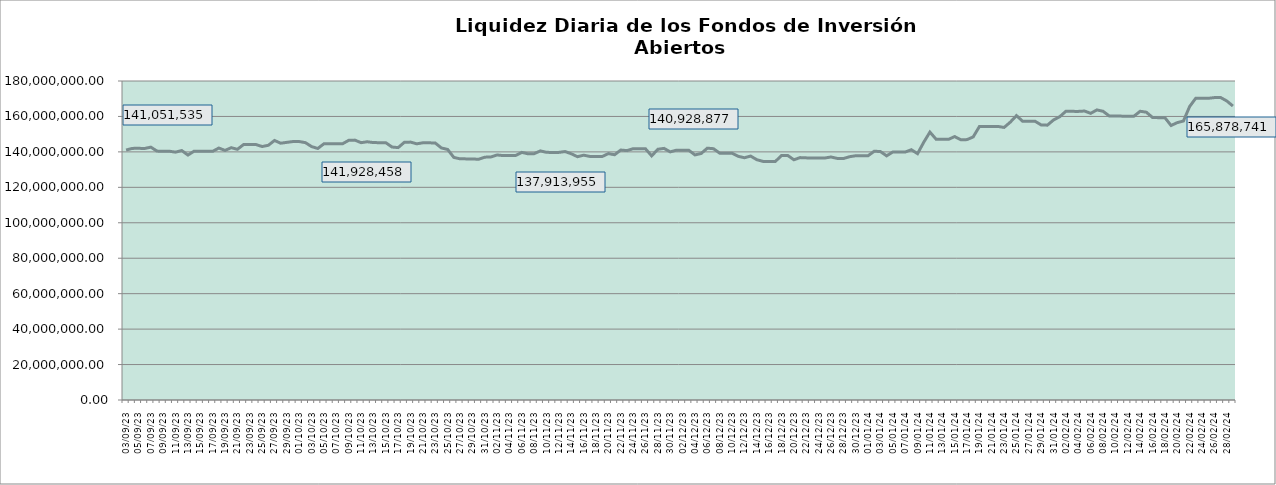
| Category | Series 0 |
|---|---|
| 2023-09-03 | 141051534.51 |
| 2023-09-04 | 141972949.27 |
| 2023-09-05 | 142009197.97 |
| 2023-09-06 | 141922684.19 |
| 2023-09-07 | 142673507.27 |
| 2023-09-08 | 140438336.78 |
| 2023-09-09 | 140378215.04 |
| 2023-09-10 | 140361923.22 |
| 2023-09-11 | 139856330.14 |
| 2023-09-12 | 140755982.43 |
| 2023-09-13 | 138209202.99 |
| 2023-09-14 | 140406022.18 |
| 2023-09-15 | 140376158.96 |
| 2023-09-16 | 140330901.12 |
| 2023-09-17 | 140314549.63 |
| 2023-09-18 | 142177404.36 |
| 2023-09-19 | 140828745.8 |
| 2023-09-20 | 142369430.66 |
| 2023-09-21 | 141452067.91 |
| 2023-09-22 | 144137154.56 |
| 2023-09-23 | 144129136.77 |
| 2023-09-24 | 144140355.03 |
| 2023-09-25 | 143030464.27 |
| 2023-09-26 | 143709526.36 |
| 2023-09-27 | 146442364.41 |
| 2023-09-28 | 144898523.31 |
| 2023-09-29 | 145379884.37 |
| 2023-09-30 | 145846882.75 |
| 2023-10-01 | 145830662.65 |
| 2023-10-02 | 145223175.32 |
| 2023-10-03 | 142991442.49 |
| 2023-10-04 | 141928458.32 |
| 2023-10-05 | 144573166.98 |
| 2023-10-06 | 144583837.61 |
| 2023-10-07 | 144582102.2 |
| 2023-10-08 | 144565903.72 |
| 2023-10-09 | 146507830.64 |
| 2023-10-10 | 146644547.24 |
| 2023-10-11 | 145204706.32 |
| 2023-10-12 | 145714461.06 |
| 2023-10-13 | 145254587.01 |
| 2023-10-14 | 145202166.02 |
| 2023-10-15 | 145186093.08 |
| 2023-10-16 | 142751003.88 |
| 2023-10-17 | 142420672.04 |
| 2023-10-18 | 145405968.76 |
| 2023-10-19 | 145524125.21 |
| 2023-10-20 | 144561548.62 |
| 2023-10-21 | 145143976.13 |
| 2023-10-22 | 145127840.58 |
| 2023-10-23 | 144997720.04 |
| 2023-10-24 | 142203772.79 |
| 2023-10-25 | 141394025.65 |
| 2023-10-26 | 136882533.54 |
| 2023-10-27 | 136093760.43 |
| 2023-10-28 | 136053297.06 |
| 2023-10-29 | 136037251.76 |
| 2023-10-30 | 135806534.56 |
| 2023-10-31 | 137019231.3 |
| 2023-11-01 | 137147206.26 |
| 2023-11-02 | 138254975.75 |
| 2023-11-03 | 137913954.8 |
| 2023-11-04 | 138011079.26 |
| 2023-11-05 | 137994487.41 |
| 2023-11-06 | 139720529.84 |
| 2023-11-07 | 138924336.01 |
| 2023-11-08 | 139010487.17 |
| 2023-11-09 | 140567934.86 |
| 2023-11-10 | 139735186.73 |
| 2023-11-11 | 139704201.44 |
| 2023-11-12 | 139724220.24 |
| 2023-11-13 | 140191854.27 |
| 2023-11-14 | 138926827.83 |
| 2023-11-15 | 137282270.7 |
| 2023-11-16 | 138142908.64 |
| 2023-11-17 | 137442252.96 |
| 2023-11-18 | 137413552.22 |
| 2023-11-19 | 137396889.14 |
| 2023-11-20 | 139040160.06 |
| 2023-11-21 | 138377572.06 |
| 2023-11-22 | 141043509.51 |
| 2023-11-23 | 140715103.37 |
| 2023-11-24 | 141802145.8 |
| 2023-11-25 | 141773249.11 |
| 2023-11-26 | 141757089.47 |
| 2023-11-27 | 137732526.98 |
| 2023-11-28 | 141477123.64 |
| 2023-11-29 | 141974288.97 |
| 2023-11-30 | 140007766.06 |
| 2023-12-01 | 140969519.96 |
| 2023-12-02 | 140928876.61 |
| 2023-12-03 | 140924197.91 |
| 2023-12-04 | 138292399.49 |
| 2023-12-05 | 139089517.65 |
| 2023-12-06 | 142102693.83 |
| 2023-12-07 | 141800672 |
| 2023-12-08 | 139282023.73 |
| 2023-12-09 | 139246490.36 |
| 2023-12-10 | 139230564.54 |
| 2023-12-11 | 137493593.8 |
| 2023-12-12 | 136695207.53 |
| 2023-12-13 | 137647237.96 |
| 2023-12-14 | 135599730.29 |
| 2023-12-15 | 134642918.31 |
| 2023-12-16 | 134594915.42 |
| 2023-12-17 | 134579064.34 |
| 2023-12-18 | 137987669.72 |
| 2023-12-19 | 137995732.42 |
| 2023-12-20 | 135553853.22 |
| 2023-12-21 | 136775176.52 |
| 2023-12-22 | 136623688.08 |
| 2023-12-23 | 136576769.35 |
| 2023-12-24 | 136561308.93 |
| 2023-12-25 | 136545464.64 |
| 2023-12-26 | 137126168.27 |
| 2023-12-27 | 136322562.51 |
| 2023-12-28 | 136241651.59 |
| 2023-12-29 | 137274974.11 |
| 2023-12-30 | 137825488.4 |
| 2023-12-31 | 137821222.69 |
| 2024-01-01 | 137831671.6 |
| 2024-01-02 | 140385040.98 |
| 2024-01-03 | 140181057.05 |
| 2024-01-04 | 137765328.28 |
| 2024-01-05 | 139949724.17 |
| 2024-01-06 | 139910516.55 |
| 2024-01-07 | 139918805.07 |
| 2024-01-08 | 141219963.12 |
| 2024-01-09 | 138987705.6 |
| 2024-01-10 | 145450284.04 |
| 2024-01-11 | 151162434.4 |
| 2024-01-12 | 147142729.73 |
| 2024-01-13 | 147072311.51 |
| 2024-01-14 | 147060778.98 |
| 2024-01-15 | 148647789.9 |
| 2024-01-16 | 146820875.14 |
| 2024-01-17 | 146929689.71 |
| 2024-01-18 | 148450891.81 |
| 2024-01-19 | 154304841.31 |
| 2024-01-20 | 154379818.66 |
| 2024-01-21 | 154366847.09 |
| 2024-01-22 | 154350922.16 |
| 2024-01-23 | 153798957.97 |
| 2024-01-24 | 156795317.88 |
| 2024-01-25 | 160465376.32 |
| 2024-01-26 | 157258481.1 |
| 2024-01-27 | 157318070.05 |
| 2024-01-28 | 157302360.63 |
| 2024-01-29 | 155177392.89 |
| 2024-01-30 | 155089695.68 |
| 2024-01-31 | 158045121.35 |
| 2024-02-01 | 159853579.52 |
| 2024-02-02 | 162968618.03 |
| 2024-02-03 | 162865025.84 |
| 2024-02-04 | 162849202.69 |
| 2024-02-05 | 163061962.07 |
| 2024-02-06 | 161756184.31 |
| 2024-02-07 | 163682341.48 |
| 2024-02-08 | 162920889.39 |
| 2024-02-09 | 160298883.84 |
| 2024-02-10 | 160195447.07 |
| 2024-02-11 | 160179108.34 |
| 2024-02-12 | 160175694.02 |
| 2024-02-13 | 160158938.89 |
| 2024-02-14 | 162934235.34 |
| 2024-02-15 | 162388406.16 |
| 2024-02-16 | 159406856.67 |
| 2024-02-17 | 159309060.62 |
| 2024-02-18 | 159292208.36 |
| 2024-02-19 | 154891322.13 |
| 2024-02-20 | 156514858.24 |
| 2024-02-21 | 157419810.56 |
| 2024-02-22 | 165600387.48 |
| 2024-02-23 | 170314791.21 |
| 2024-02-24 | 170223879.42 |
| 2024-02-25 | 170235136.11 |
| 2024-02-26 | 170626997.36 |
| 2024-02-27 | 170700410.43 |
| 2024-02-28 | 168760169.61 |
| 2024-02-29 | 165878740.51 |